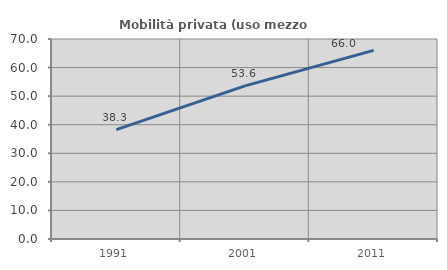
| Category | Mobilità privata (uso mezzo privato) |
|---|---|
| 1991.0 | 38.256 |
| 2001.0 | 53.591 |
| 2011.0 | 66.019 |